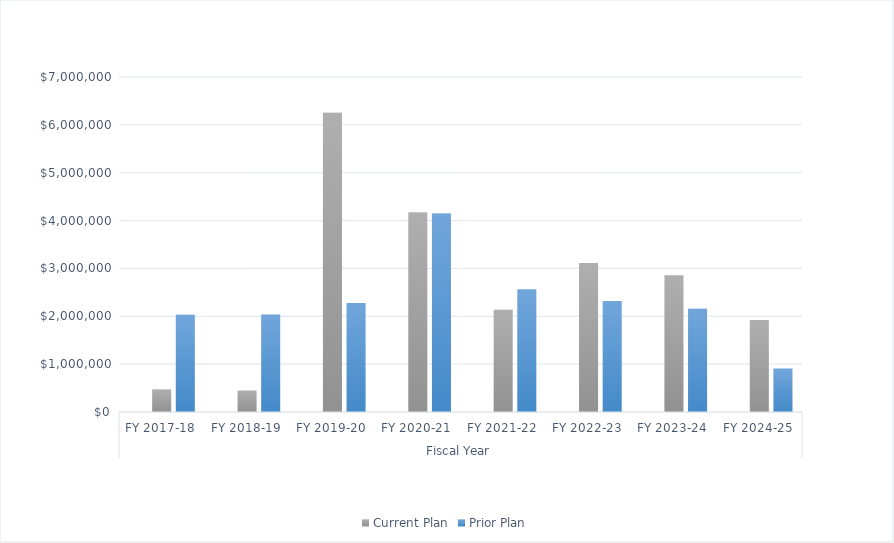
| Category | Series 0 | Current Plan | Prior Plan |
|---|---|---|---|
| 0 |  | 473371 | 2030000 |
| 1 |  | 449782 | 2038370 |
| 2 |  | 6250900 | 2278813.2 |
| 3 |  | 4166534.375 | 4145888.193 |
| 4 |  | 2139143.247 | 2565738.021 |
| 5 |  | 3112762.093 | 2320692.806 |
| 6 |  | 2857747.657 | 2159443.578 |
| 7 |  | 1921174.866 | 907031.976 |